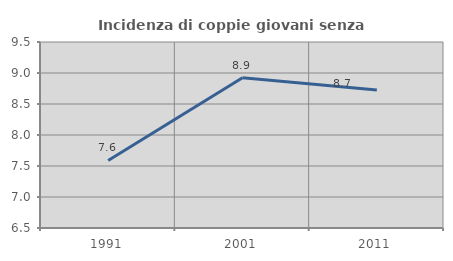
| Category | Incidenza di coppie giovani senza figli |
|---|---|
| 1991.0 | 7.589 |
| 2001.0 | 8.922 |
| 2011.0 | 8.725 |